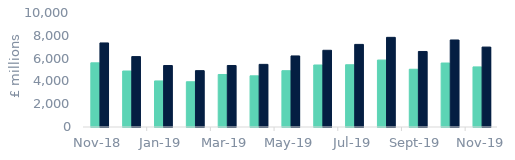
| Category | First-time
buyers | Homemovers |
|---|---|---|
| 2018-11-01 | 5629.844 | 7374.523 |
| 2018-12-01 | 4911.601 | 6177.272 |
| 2019-01-01 | 4040.195 | 5392.872 |
| 2019-02-01 | 3968.57 | 4943.288 |
| 2019-03-01 | 4606.614 | 5395.078 |
| 2019-04-01 | 4489.256 | 5493.735 |
| 2019-05-01 | 4939.034 | 6233.546 |
| 2019-06-01 | 5439.294 | 6728.498 |
| 2019-07-01 | 5460.553 | 7246.099 |
| 2019-08-01 | 5871.982 | 7863.959 |
| 2019-09-01 | 5065.049 | 6624.703 |
| 2019-10-01 | 5612.158 | 7634.011 |
| 2019-11-01 | 5270.504 | 7011.799 |